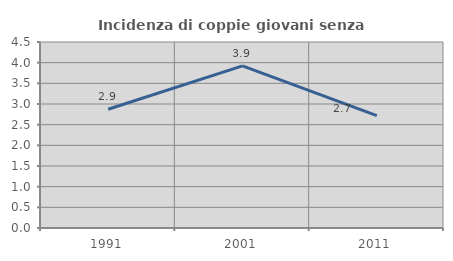
| Category | Incidenza di coppie giovani senza figli |
|---|---|
| 1991.0 | 2.874 |
| 2001.0 | 3.922 |
| 2011.0 | 2.717 |